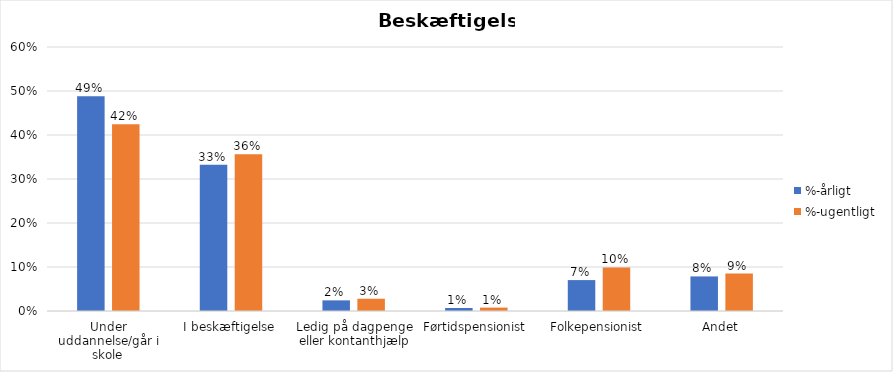
| Category | %-årligt | %-ugentligt |
|---|---|---|
| Under uddannelse/går i skole | 0.488 | 0.424 |
| I beskæftigelse | 0.332 | 0.356 |
| Ledig på dagpenge eller kontanthjælp | 0.024 | 0.028 |
| Førtidspensionist | 0.007 | 0.008 |
| Folkepensionist | 0.07 | 0.099 |
| Andet | 0.079 | 0.085 |